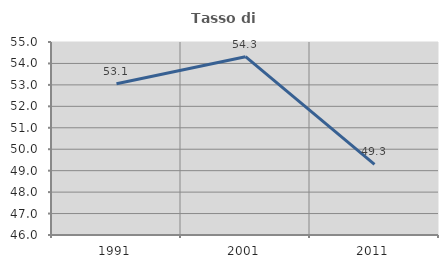
| Category | Tasso di occupazione   |
|---|---|
| 1991.0 | 53.051 |
| 2001.0 | 54.316 |
| 2011.0 | 49.29 |